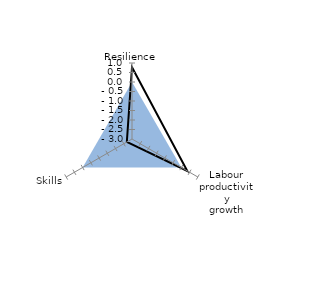
| Category | OECD average | Priority: skills |
|---|---|---|
| Resilience | 0 | 0.773 |
| Labour productivity
growth | 0 | 0.362 |
| Skills | 0 | -2.686 |